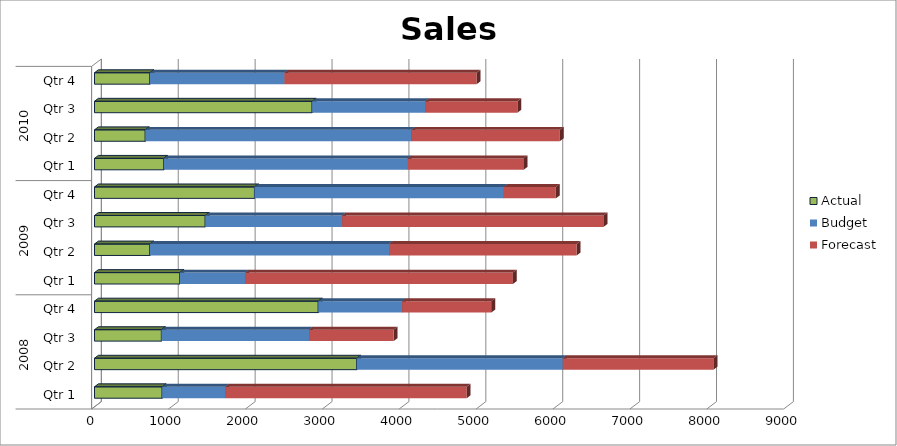
| Category | Actual | Budget | Forecast |
|---|---|---|---|
| 0 | 880 | 820 | 3140 |
| 1 | 3410 | 2680 | 1960 |
| 2 | 870 | 1920 | 1100 |
| 3 | 2910 | 1090 | 1160 |
| 4 | 1110 | 850 | 3480 |
| 5 | 720 | 3110 | 2440 |
| 6 | 1440 | 1780 | 3400 |
| 7 | 2080 | 3240 | 680 |
| 8 | 900 | 3170 | 1510 |
| 9 | 660 | 3460 | 1930 |
| 10 | 2830 | 1470 | 1200 |
| 11 | 720 | 1750 | 2500 |